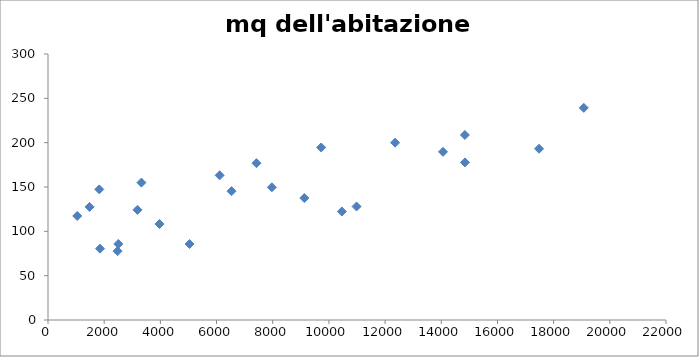
| Category | mq dell'abitazione principale |
|---|---|
| 2503.0 | 85.765 |
| 6111.0 | 163.166 |
| 3325.0 | 154.957 |
| 6535.0 | 145.329 |
| 17481.0 | 193.153 |
| 14062.0 | 189.716 |
| 9725.0 | 194.598 |
| 7421.0 | 176.847 |
| 14841.0 | 208.689 |
| 2476.0 | 77.628 |
| 19074.0 | 239.277 |
| 1852.0 | 80.445 |
| 5040.0 | 85.704 |
| 3184.0 | 124.238 |
| 1480.0 | 127.548 |
| 7971.0 | 149.652 |
| 10461.0 | 122.351 |
| 3968.0 | 108.237 |
| 14844.0 | 177.704 |
| 12357.0 | 200.021 |
| 1041.0 | 117.309 |
| 9125.0 | 137.538 |
| 1826.0 | 147.313 |
| 10984.0 | 128.018 |